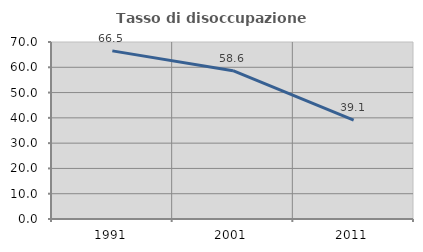
| Category | Tasso di disoccupazione giovanile  |
|---|---|
| 1991.0 | 66.485 |
| 2001.0 | 58.642 |
| 2011.0 | 39.13 |